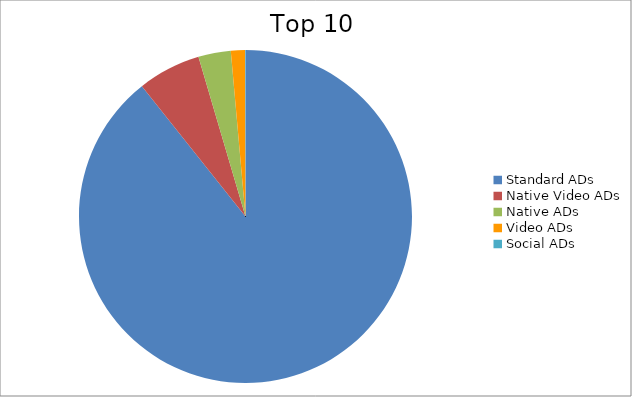
| Category | Series 0 |
|---|---|
| Standard ADs | 89.31 |
| Native Video ADs | 6.13 |
| Native ADs | 3.15 |
| Video ADs | 1.36 |
| Social ADs | 0.05 |